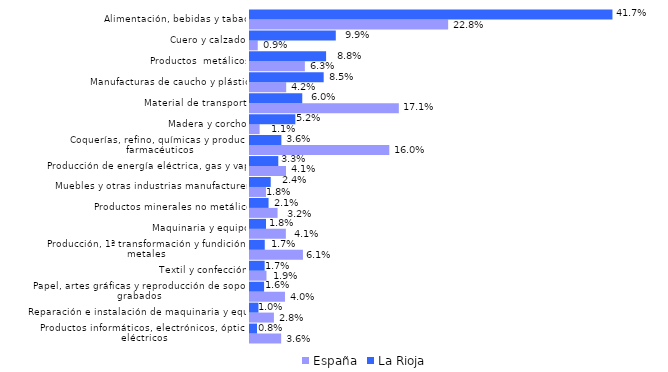
| Category | España | La Rioja |
|---|---|---|
| Productos informáticos, electrónicos, ópticos y eléctricos | 0.036 | 0.008 |
| Reparación e instalación de maquinaria y equipo | 0.028 | 0.01 |
| Papel, artes gráficas y reproducción de soportes grabados | 0.04 | 0.016 |
| Textil y confección | 0.019 | 0.017 |
| Producción, 1ª transformación y fundición de metales | 0.061 | 0.017 |
| Maquinaria y equipo | 0.041 | 0.018 |
| Productos minerales no metálicos | 0.032 | 0.021 |
| Muebles y otras industrias manufactureras | 0.018 | 0.024 |
| Producción de energía eléctrica, gas y vapor | 0.041 | 0.033 |
| Coquerías, refino, químicas y productos farmacéuticos | 0.16 | 0.036 |
| Madera y corcho | 0.011 | 0.052 |
| Material de transporte | 0.171 | 0.06 |
| Manufacturas de caucho y plástico | 0.042 | 0.085 |
| Productos  metálicos | 0.063 | 0.088 |
| Cuero y calzado | 0.009 | 0.099 |
| Alimentación, bebidas y tabaco | 0.228 | 0.417 |